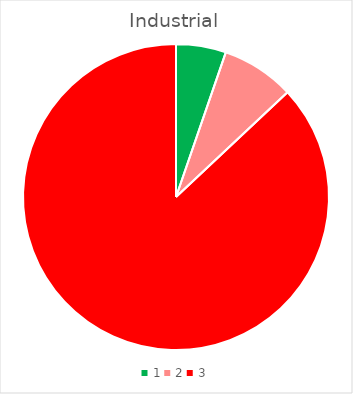
| Category | Series 0 |
|---|---|
| 0 | 0.401 |
| 1 | 0.586 |
| 2 | 6.603 |